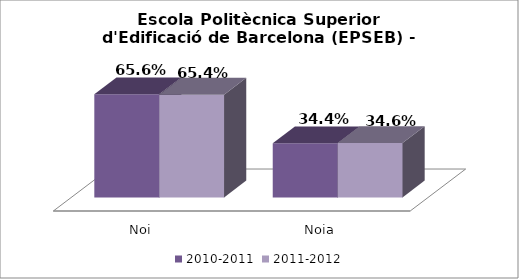
| Category | 2010-2011 | 2011-2012 |
|---|---|---|
| Noi | 0.656 | 0.654 |
| Noia | 0.344 | 0.346 |